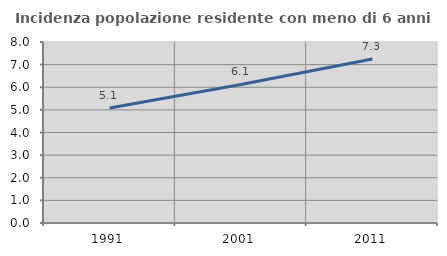
| Category | Incidenza popolazione residente con meno di 6 anni |
|---|---|
| 1991.0 | 5.083 |
| 2001.0 | 6.124 |
| 2011.0 | 7.253 |